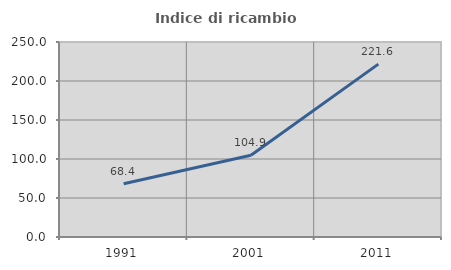
| Category | Indice di ricambio occupazionale  |
|---|---|
| 1991.0 | 68.354 |
| 2001.0 | 104.865 |
| 2011.0 | 221.6 |